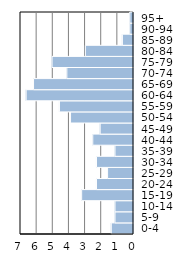
| Category | Series 0 |
|---|---|
| 0-4 | 1.376 |
| 5-9 | 1.147 |
| 10-14 | 1.147 |
| 15-19 | 3.211 |
| 20-24 | 2.294 |
| 25-29 | 1.606 |
| 30-34 | 2.294 |
| 35-39 | 1.147 |
| 40-44 | 2.523 |
| 45-49 | 2.064 |
| 50-54 | 3.899 |
| 55-59 | 4.587 |
| 60-64 | 6.651 |
| 65-69 | 6.193 |
| 70-74 | 4.128 |
| 75-79 | 5.046 |
| 80-84 | 2.982 |
| 85-89 | 0.688 |
| 90-94 | 0.229 |
| 95+ | 0.229 |